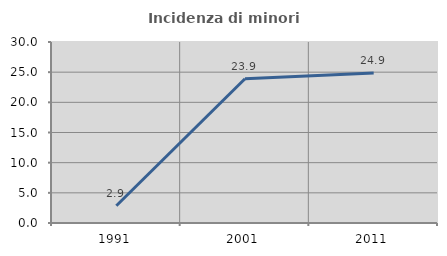
| Category | Incidenza di minori stranieri |
|---|---|
| 1991.0 | 2.857 |
| 2001.0 | 23.913 |
| 2011.0 | 24.868 |